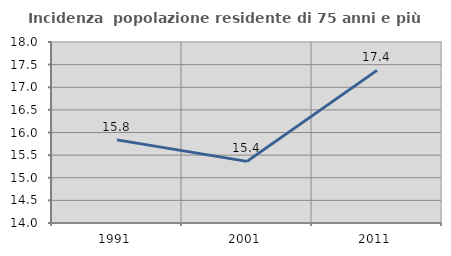
| Category | Incidenza  popolazione residente di 75 anni e più |
|---|---|
| 1991.0 | 15.837 |
| 2001.0 | 15.362 |
| 2011.0 | 17.373 |